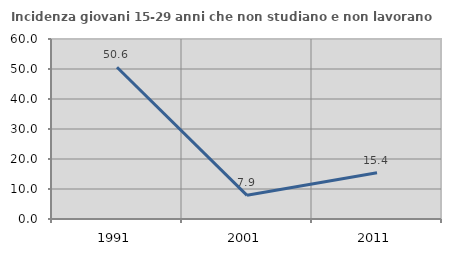
| Category | Incidenza giovani 15-29 anni che non studiano e non lavorano  |
|---|---|
| 1991.0 | 50.585 |
| 2001.0 | 7.895 |
| 2011.0 | 15.385 |